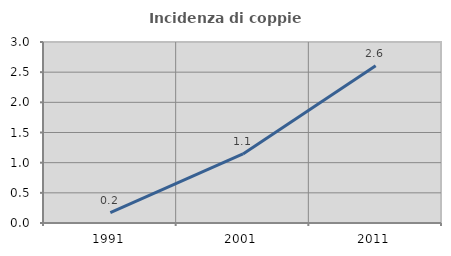
| Category | Incidenza di coppie miste |
|---|---|
| 1991.0 | 0.17 |
| 2001.0 | 1.145 |
| 2011.0 | 2.606 |